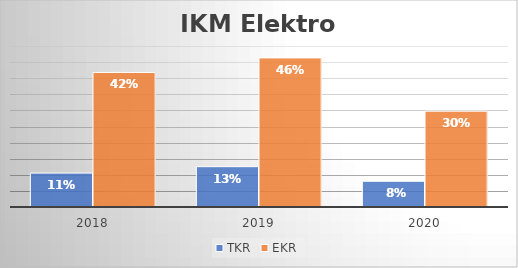
| Category | TKR | EKR |
|---|---|---|
| 2018.0 | 0.105 | 0.418 |
| 2019.0 | 0.125 | 0.463 |
| 2020.0 | 0.08 | 0.298 |